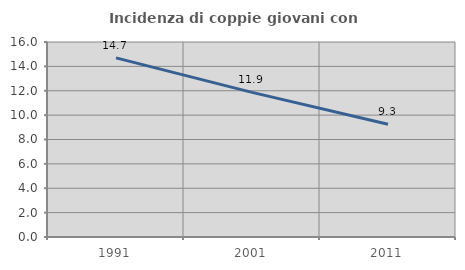
| Category | Incidenza di coppie giovani con figli |
|---|---|
| 1991.0 | 14.698 |
| 2001.0 | 11.869 |
| 2011.0 | 9.255 |